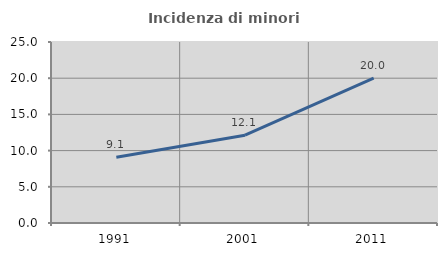
| Category | Incidenza di minori stranieri |
|---|---|
| 1991.0 | 9.091 |
| 2001.0 | 12.121 |
| 2011.0 | 20 |